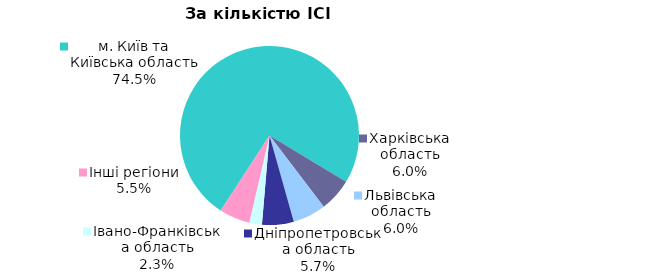
| Category | Series 0 |
|---|---|
| м. Київ та Київська область | 0.745 |
| Харківська область | 0.06 |
| Львівська область | 0.06 |
| Дніпропетровська область | 0.057 |
| Iвано-Франкiвська область | 0.023 |
| Інші регіони | 0.055 |